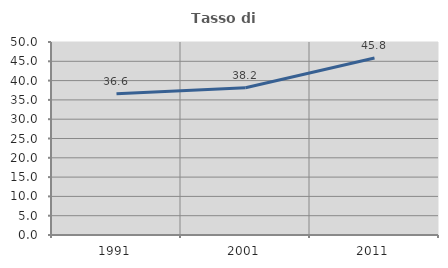
| Category | Tasso di occupazione   |
|---|---|
| 1991.0 | 36.607 |
| 2001.0 | 38.158 |
| 2011.0 | 45.833 |